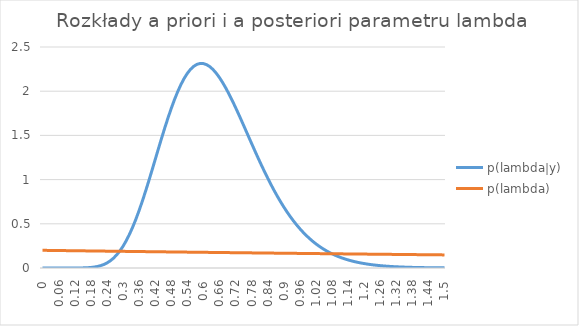
| Category | p(lambda|y) | p(lambda) |
|---|---|---|
| 0.0 | 0 | 0.2 |
| 0.012 | 0 | 0.2 |
| 0.024 | 0 | 0.199 |
| 0.036 | 0 | 0.199 |
| 0.048 | 0 | 0.198 |
| 0.06 | 0 | 0.198 |
| 0.072 | 0 | 0.197 |
| 0.084 | 0 | 0.197 |
| 0.096 | 0 | 0.196 |
| 0.108 | 0 | 0.196 |
| 0.12 | 0 | 0.195 |
| 0.132 | 0 | 0.195 |
| 0.144 | 0.001 | 0.194 |
| 0.156 | 0.002 | 0.194 |
| 0.168 | 0.003 | 0.193 |
| 0.18 | 0.006 | 0.193 |
| 0.192 | 0.01 | 0.192 |
| 0.204 | 0.017 | 0.192 |
| 0.216 | 0.026 | 0.192 |
| 0.228 | 0.039 | 0.191 |
| 0.24 | 0.057 | 0.191 |
| 0.252 | 0.08 | 0.19 |
| 0.264 | 0.109 | 0.19 |
| 0.276 | 0.146 | 0.189 |
| 0.288 | 0.191 | 0.189 |
| 0.3 | 0.245 | 0.188 |
| 0.312 | 0.307 | 0.188 |
| 0.324 | 0.379 | 0.187 |
| 0.336 | 0.46 | 0.187 |
| 0.348 | 0.55 | 0.187 |
| 0.36 | 0.648 | 0.186 |
| 0.372 | 0.753 | 0.186 |
| 0.384 | 0.865 | 0.185 |
| 0.396 | 0.981 | 0.185 |
| 0.408 | 1.101 | 0.184 |
| 0.42 | 1.223 | 0.184 |
| 0.432 | 1.345 | 0.183 |
| 0.444 | 1.466 | 0.183 |
| 0.456 | 1.584 | 0.183 |
| 0.468 | 1.697 | 0.182 |
| 0.48 | 1.803 | 0.182 |
| 0.492 | 1.902 | 0.181 |
| 0.504 | 1.992 | 0.181 |
| 0.516 | 2.072 | 0.18 |
| 0.528 | 2.142 | 0.18 |
| 0.54 | 2.2 | 0.18 |
| 0.552 | 2.247 | 0.179 |
| 0.564 | 2.281 | 0.179 |
| 0.576 | 2.303 | 0.178 |
| 0.588 | 2.314 | 0.178 |
| 0.6 | 2.313 | 0.177 |
| 0.612 | 2.301 | 0.177 |
| 0.624 | 2.278 | 0.177 |
| 0.636 | 2.246 | 0.176 |
| 0.648 | 2.204 | 0.176 |
| 0.66 | 2.155 | 0.175 |
| 0.672 | 2.098 | 0.175 |
| 0.684 | 2.035 | 0.174 |
| 0.696 | 1.967 | 0.174 |
| 0.708 | 1.894 | 0.174 |
| 0.72 | 1.818 | 0.173 |
| 0.732 | 1.738 | 0.173 |
| 0.744 | 1.657 | 0.172 |
| 0.756 | 1.575 | 0.172 |
| 0.768 | 1.493 | 0.172 |
| 0.78 | 1.41 | 0.171 |
| 0.792 | 1.328 | 0.171 |
| 0.804 | 1.248 | 0.17 |
| 0.816 | 1.169 | 0.17 |
| 0.828 | 1.093 | 0.169 |
| 0.84 | 1.019 | 0.169 |
| 0.852 | 0.947 | 0.169 |
| 0.864 | 0.879 | 0.168 |
| 0.876 | 0.813 | 0.168 |
| 0.888 | 0.751 | 0.167 |
| 0.9 | 0.692 | 0.167 |
| 0.912 | 0.636 | 0.167 |
| 0.924 | 0.584 | 0.166 |
| 0.936 | 0.535 | 0.166 |
| 0.948 | 0.489 | 0.165 |
| 0.96 | 0.446 | 0.165 |
| 0.972 | 0.406 | 0.165 |
| 0.984 | 0.369 | 0.164 |
| 0.996 | 0.335 | 0.164 |
| 1.008 | 0.303 | 0.163 |
| 1.02 | 0.274 | 0.163 |
| 1.032 | 0.247 | 0.163 |
| 1.044 | 0.223 | 0.162 |
| 1.056 | 0.2 | 0.162 |
| 1.068 | 0.18 | 0.162 |
| 1.08 | 0.161 | 0.161 |
| 1.092 | 0.145 | 0.161 |
| 1.104 | 0.129 | 0.16 |
| 1.116 | 0.116 | 0.16 |
| 1.128 | 0.103 | 0.16 |
| 1.14 | 0.092 | 0.159 |
| 1.152 | 0.082 | 0.159 |
| 1.164 | 0.072 | 0.158 |
| 1.176 | 0.064 | 0.158 |
| 1.188 | 0.057 | 0.158 |
| 1.2 | 0.05 | 0.157 |
| 1.212 | 0.045 | 0.157 |
| 1.224 | 0.039 | 0.157 |
| 1.236 | 0.035 | 0.156 |
| 1.248 | 0.031 | 0.156 |
| 1.26 | 0.027 | 0.155 |
| 1.272 | 0.024 | 0.155 |
| 1.284 | 0.021 | 0.155 |
| 1.296 | 0.018 | 0.154 |
| 1.308 | 0.016 | 0.154 |
| 1.32 | 0.014 | 0.154 |
| 1.332 | 0.012 | 0.153 |
| 1.344 | 0.011 | 0.153 |
| 1.356 | 0.009 | 0.152 |
| 1.368 | 0.008 | 0.152 |
| 1.38 | 0.007 | 0.152 |
| 1.392 | 0.006 | 0.151 |
| 1.404 | 0.005 | 0.151 |
| 1.416 | 0.005 | 0.151 |
| 1.428 | 0.004 | 0.15 |
| 1.44 | 0.003 | 0.15 |
| 1.452 | 0.003 | 0.15 |
| 1.464 | 0.003 | 0.149 |
| 1.476 | 0.002 | 0.149 |
| 1.488 | 0.002 | 0.149 |
| 1.5 | 0.002 | 0.148 |